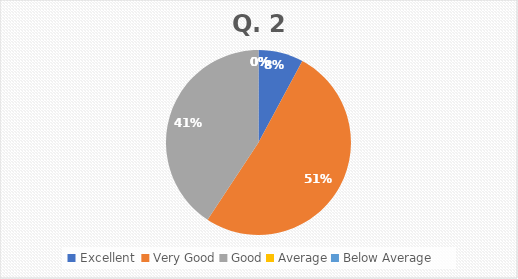
| Category | Series 0 |
|---|---|
| Excellent  | 11 |
| Very Good | 72 |
| Good | 57 |
| Average | 0 |
| Below Average | 0 |